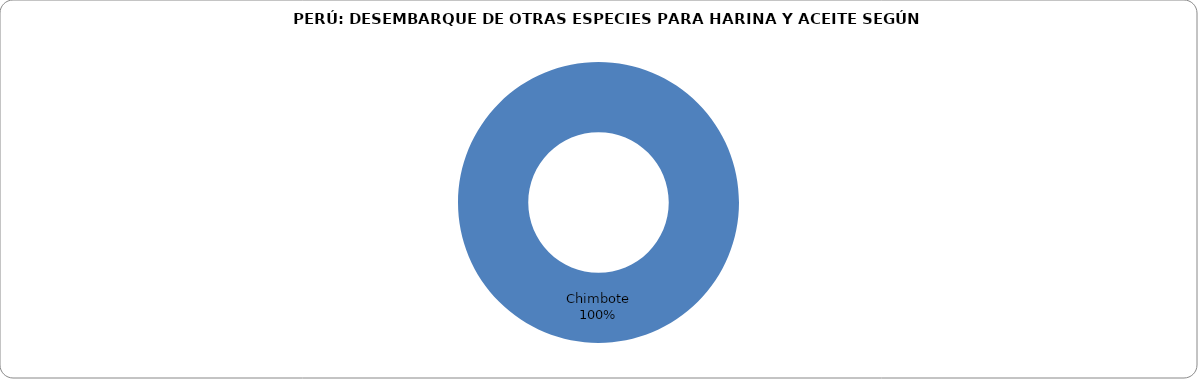
| Category | Series 0 |
|---|---|
| Chimbote | 0.977 |
| Callao | 0 |
| Pisco | 0 |
| Otros | 0 |